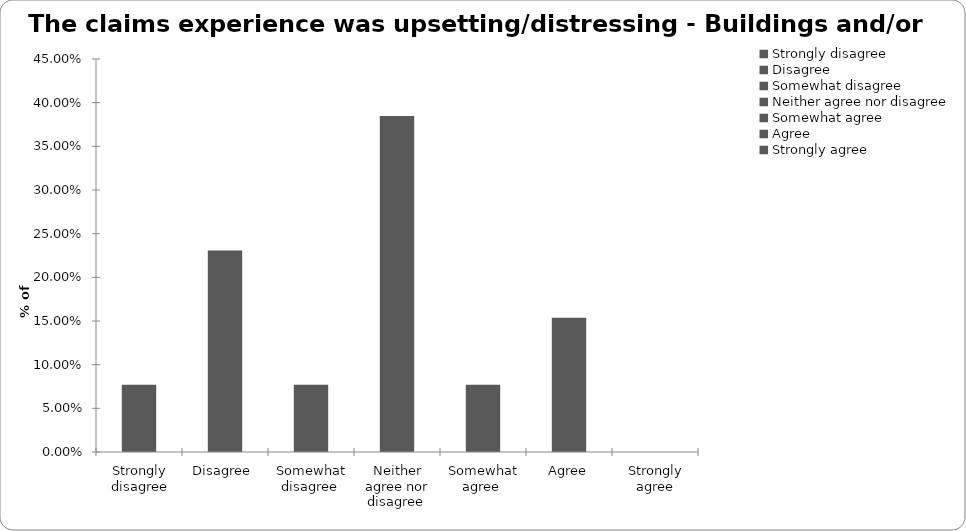
| Category | Series 1 |
|---|---|
| Strongly disagree | 0.077 |
| Disagree  | 0.231 |
| Somewhat disagree  | 0.077 |
| Neither agree nor disagree  | 0.385 |
| Somewhat agree  | 0.077 |
| Agree | 0.154 |
| Strongly agree | 0 |